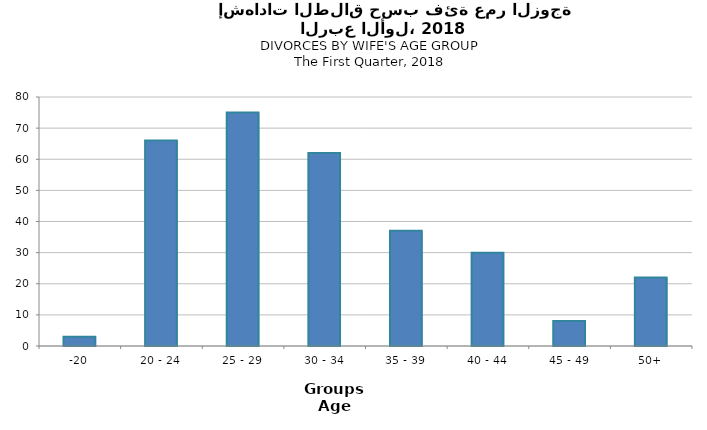
| Category | Series 0 |
|---|---|
| -20 | 3 |
| 20 - 24 | 66 |
| 25 - 29 | 75 |
| 30 - 34 | 62 |
| 35 - 39 | 37 |
| 40 - 44 | 30 |
| 45 - 49 | 8 |
| 50+ | 22 |